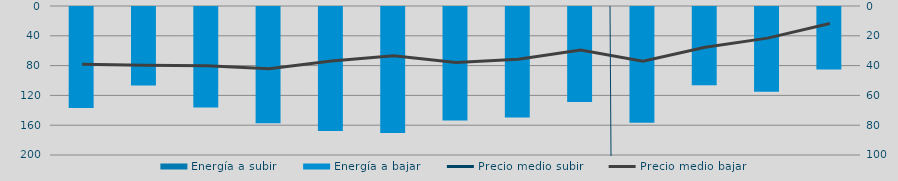
| Category | Energía a subir | Energía a bajar |
|---|---|---|
| D |  | 136.934 |
| E |  | 106.844 |
| F |  | 136.078 |
| M |  | 157.467 |
| A |  | 167.866 |
| M |  | 170.333 |
| J |  | 153.818 |
| J |  | 149.517 |
| A |  | 128.775 |
| S |  | 156.615 |
| O |  | 106.427 |
| N |  | 115.196 |
| D |  | 85.375 |